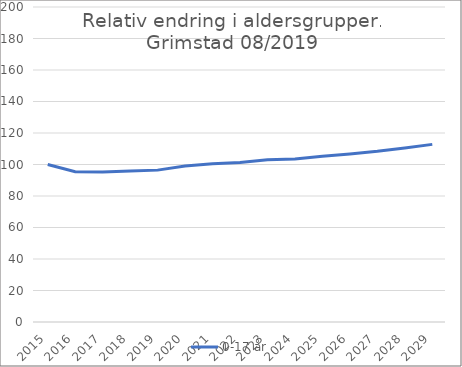
| Category | 0-17 år |
|---|---|
| 2015.0 | 100 |
| 2016.0 | 95.449 |
| 2017.0 | 95.174 |
| 2018.0 | 95.796 |
| 2019.0 | 96.428 |
| 2020.0 | 99.009 |
| 2021.0 | 100.497 |
| 2022.0 | 101.345 |
| 2023.0 | 103.002 |
| 2024.0 | 103.567 |
| 2025.0 | 105.231 |
| 2026.0 | 106.726 |
| 2027.0 | 108.38 |
| 2028.0 | 110.492 |
| 2029.0 | 112.777 |